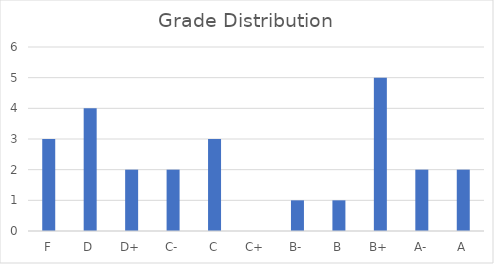
| Category | Series 0 |
|---|---|
| F | 3 |
| D | 4 |
| D+ | 2 |
| C- | 2 |
| C | 3 |
| C+ | 0 |
| B- | 1 |
| B | 1 |
| B+ | 5 |
| A- | 2 |
| A | 2 |